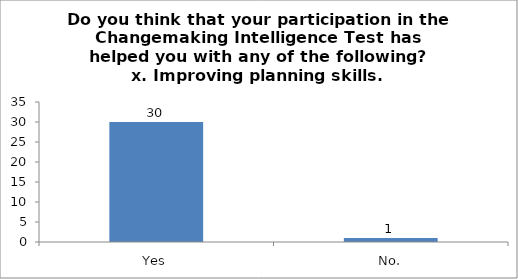
| Category | Do you think that your participation in the Changemaking Intelligence Test has helped you with any of the following?
x. Improving planning skills. |
|---|---|
| Yes | 30 |
| No. | 1 |